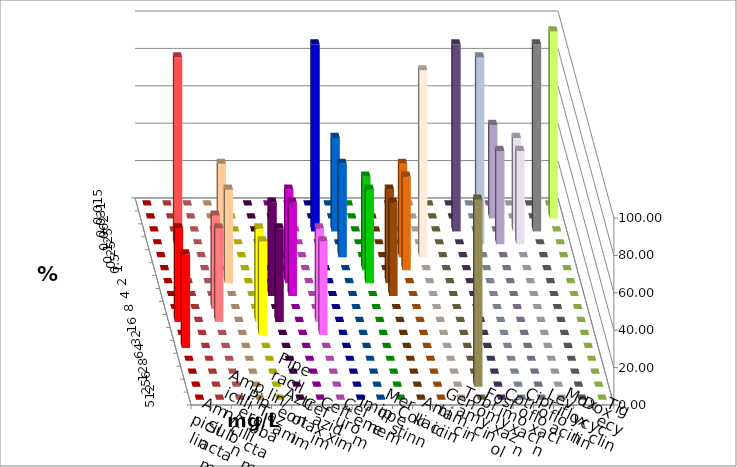
| Category | Ampicillin | Ampicillin/ Sulbactam | Piperacillin | Piperacillin/ Tazobactam | Aztreonam | Cefotaxim | Ceftazidim | Cefuroxim | Imipenem | Meropenem | Colistin | Amikacin | Gentamicin | Tobramycin | Fosfomycin | Cotrimoxazol | Ciprofloxacin | Levofloxacin | Moxifloxacin | Doxycyclin | Tigecyclin |
|---|---|---|---|---|---|---|---|---|---|---|---|---|---|---|---|---|---|---|---|---|---|
| 0.015 | 0 | 0 | 0 | 0 | 0 | 0 | 0 | 0 | 0 | 0 | 0 | 0 | 0 | 0 | 0 | 0 | 0 | 0 | 0 | 0 | 0 |
| 0.031 | 0 | 0 | 0 | 0 | 0 | 0 | 0 | 0 | 0 | 0 | 0 | 0 | 0 | 0 | 0 | 0 | 0 | 50 | 0 | 0 | 100 |
| 0.062 | 0 | 0 | 0 | 0 | 0 | 0 | 0 | 0 | 100 | 50 | 0 | 0 | 0 | 0 | 0 | 100 | 0 | 0 | 50 | 100 | 0 |
| 0.125 | 0 | 100 | 0 | 0 | 0 | 0 | 0 | 0 | 0 | 0 | 0 | 0 | 0 | 0 | 0 | 0 | 100 | 50 | 50 | 0 | 0 |
| 0.25 | 0 | 0 | 0 | 50 | 0 | 0 | 0 | 0 | 0 | 50 | 0 | 0 | 50 | 100 | 0 | 0 | 0 | 0 | 0 | 0 | 0 |
| 0.5 | 0 | 0 | 0 | 0 | 0 | 0 | 0 | 0 | 0 | 0 | 50 | 0 | 50 | 0 | 0 | 0 | 0 | 0 | 0 | 0 | 0 |
| 1.0 | 0 | 0 | 0 | 50 | 0 | 0 | 50 | 0 | 0 | 0 | 50 | 50 | 0 | 0 | 0 | 0 | 0 | 0 | 0 | 0 | 0 |
| 2.0 | 0 | 0 | 0 | 0 | 0 | 50 | 50 | 0 | 0 | 0 | 0 | 50 | 0 | 0 | 0 | 0 | 0 | 0 | 0 | 0 | 0 |
| 4.0 | 0 | 0 | 50 | 0 | 0 | 0 | 0 | 0 | 0 | 0 | 0 | 0 | 0 | 0 | 0 | 0 | 0 | 0 | 0 | 0 | 0 |
| 8.0 | 50 | 0 | 50 | 0 | 50 | 50 | 0 | 50 | 0 | 0 | 0 | 0 | 0 | 0 | 0 | 0 | 0 | 0 | 0 | 0 | 0 |
| 16.0 | 0 | 0 | 0 | 0 | 50 | 0 | 0 | 50 | 0 | 0 | 0 | 0 | 0 | 0 | 0 | 0 | 0 | 0 | 0 | 0 | 0 |
| 32.0 | 50 | 0 | 0 | 0 | 0 | 0 | 0 | 0 | 0 | 0 | 0 | 0 | 0 | 0 | 0 | 0 | 0 | 0 | 0 | 0 | 0 |
| 64.0 | 0 | 0 | 0 | 0 | 0 | 0 | 0 | 0 | 0 | 0 | 0 | 0 | 0 | 0 | 0 | 0 | 0 | 0 | 0 | 0 | 0 |
| 128.0 | 0 | 0 | 0 | 0 | 0 | 0 | 0 | 0 | 0 | 0 | 0 | 0 | 0 | 0 | 0 | 0 | 0 | 0 | 0 | 0 | 0 |
| 256.0 | 0 | 0 | 0 | 0 | 0 | 0 | 0 | 0 | 0 | 0 | 0 | 0 | 0 | 0 | 100 | 0 | 0 | 0 | 0 | 0 | 0 |
| 512.0 | 0 | 0 | 0 | 0 | 0 | 0 | 0 | 0 | 0 | 0 | 0 | 0 | 0 | 0 | 0 | 0 | 0 | 0 | 0 | 0 | 0 |